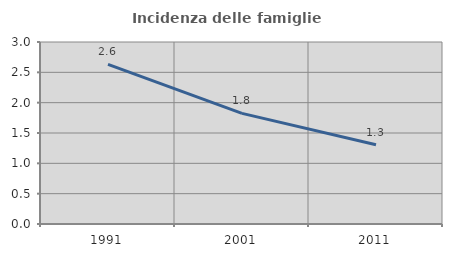
| Category | Incidenza delle famiglie numerose |
|---|---|
| 1991.0 | 2.632 |
| 2001.0 | 1.823 |
| 2011.0 | 1.306 |